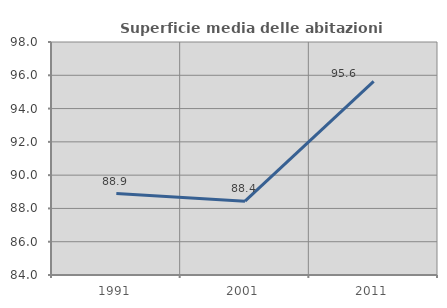
| Category | Superficie media delle abitazioni occupate |
|---|---|
| 1991.0 | 88.895 |
| 2001.0 | 88.438 |
| 2011.0 | 95.64 |